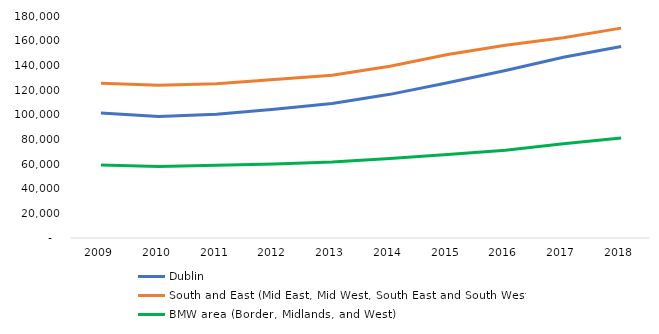
| Category | Dublin | South and East (Mid East, Mid West, South East and South West) | BMW area (Border, Midlands, and West) |
|---|---|---|---|
| 2009.0 | 101326 | 125563 | 59223 |
| 2010.0 | 98418 | 123819 | 57933 |
| 2011.0 | 100250 | 125015 | 59037 |
| 2012.0 | 104358 | 128454 | 59900 |
| 2013.0 | 109061 | 131937 | 61587 |
| 2014.0 | 116470 | 139311 | 64372 |
| 2015.0 | 125954 | 148733 | 67658 |
| 2016.0 | 135744 | 156288 | 71231 |
| 2017.0 | 146516 | 162291 | 76434 |
| 2018.0 | 155324 | 170181 | 81015 |